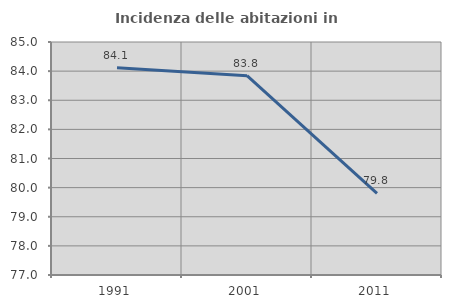
| Category | Incidenza delle abitazioni in proprietà  |
|---|---|
| 1991.0 | 84.112 |
| 2001.0 | 83.844 |
| 2011.0 | 79.803 |